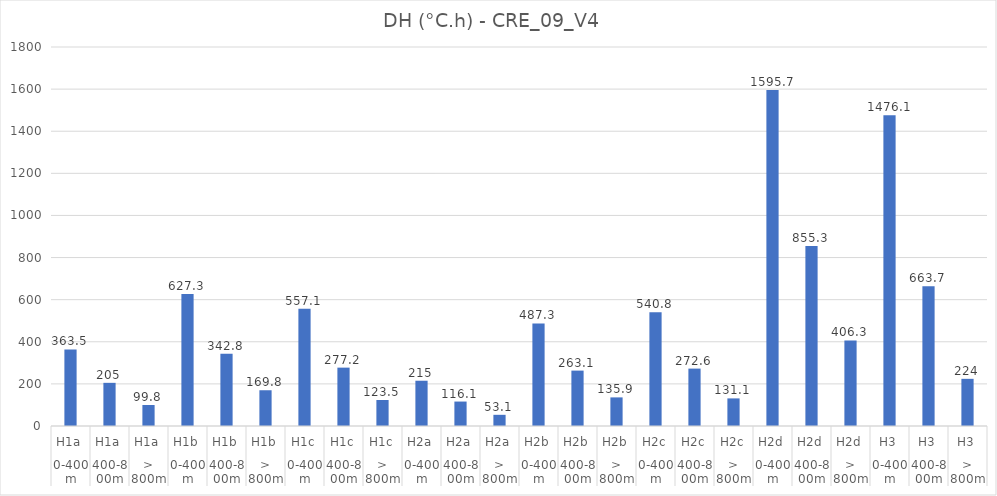
| Category | Degrés-heures d'inconfort DH (°C,h) |
|---|---|
| 0 | 363.5 |
| 1 | 205 |
| 2 | 99.8 |
| 3 | 627.3 |
| 4 | 342.8 |
| 5 | 169.8 |
| 6 | 557.1 |
| 7 | 277.2 |
| 8 | 123.5 |
| 9 | 215 |
| 10 | 116.1 |
| 11 | 53.1 |
| 12 | 487.3 |
| 13 | 263.1 |
| 14 | 135.9 |
| 15 | 540.8 |
| 16 | 272.6 |
| 17 | 131.1 |
| 18 | 1595.7 |
| 19 | 855.3 |
| 20 | 406.3 |
| 21 | 1476.1 |
| 22 | 663.7 |
| 23 | 224 |